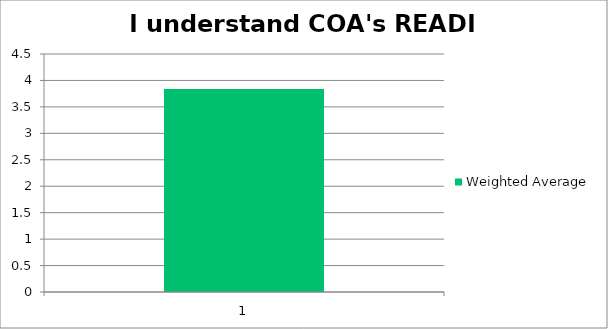
| Category | Weighted Average |
|---|---|
| 1.0 | 3.84 |